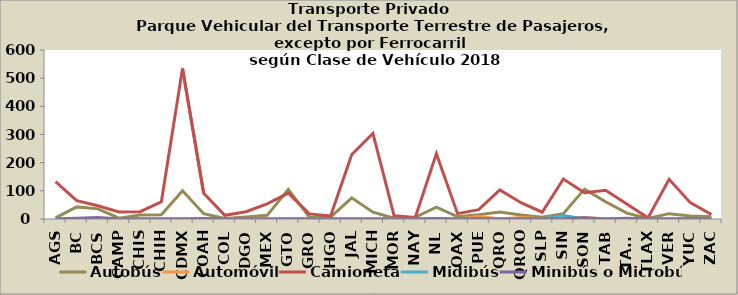
| Category | Autobús | Automóvil | Camioneta | Midibús | Minibús o Microbús |
|---|---|---|---|---|---|
| AGS | 4 | 0 | 133 | 0 | 0 |
| BC | 43 | 1 | 65 | 0 | 3 |
| BCS | 36 | 0 | 47 | 1 | 5 |
| CAMP | 3 | 2 | 25 | 0 | 0 |
| CHIS | 14 | 0 | 26 | 0 | 0 |
| CHIH | 15 | 0 | 61 | 0 | 0 |
| CDMX | 100 | 0 | 534 | 0 | 0 |
| COAH | 19 | 0 | 91 | 0 | 2 |
| COL | 2 | 0 | 13 | 0 | 0 |
| DGO | 7 | 0 | 26 | 0 | 0 |
| MEX | 13 | 0 | 54 | 0 | 0 |
| GTO | 105 | 0 | 92 | 0 | 0 |
| GRO | 6 | 1 | 18 | 0 | 0 |
| HGO | 7 | 0 | 11 | 0 | 0 |
| JAL | 75 | 0 | 229 | 0 | 0 |
| MICH | 24 | 0 | 304 | 0 | 0 |
| MOR | 3 | 0 | 12 | 0 | 0 |
| NAY | 6 | 0 | 5 | 0 | 0 |
| NL | 42 | 0 | 232 | 0 | 2 |
| OAX | 8 | 0 | 19 | 0 | 0 |
| PUE | 15 | 9 | 33 | 0 | 1 |
| QRO | 25 | 0 | 103 | 0 | 0 |
| QROO | 14 | 5 | 58 | 0 | 0 |
| SLP | 6 | 0 | 24 | 0 | 0 |
| SIN | 19 | 1 | 142 | 12 | 1 |
| SON | 106 | 5 | 93 | 0 | 4 |
| TAB | 61 | 0 | 102 | 0 | 0 |
| TAMS | 21 | 0 | 53 | 0 | 3 |
| TLAX | 2 | 0 | 4 | 0 | 0 |
| VER | 19 | 1 | 141 | 0 | 0 |
| YUC | 11 | 0 | 58 | 0 | 1 |
| ZAC | 8 | 0 | 16 | 0 | 0 |